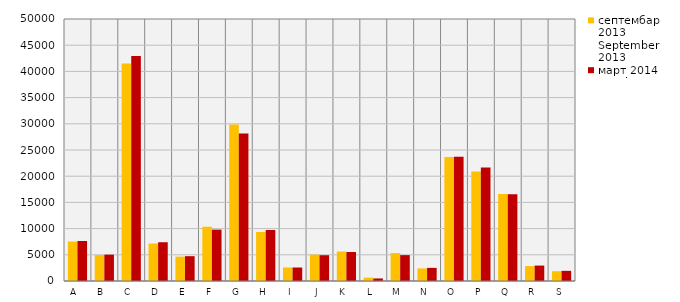
| Category | септембар 2013
September 2013 | март 2014
March 2014 |
|---|---|---|
| A  | 7527 | 7634 |
| B  | 4937 | 5028 |
| C  | 41525 | 42962 |
| D  | 7154 | 7400 |
| Е  | 4650 | 4739 |
| F  | 10359 | 9805 |
| G  | 29889 | 28140 |
| H  | 9362 | 9728 |
| I  | 2581 | 2573 |
| J  | 5033 | 4922 |
| K  | 5628 | 5532 |
| L  | 643 | 487 |
| M  | 5322 | 4940 |
| N  | 2392 | 2506 |
| O  | 23683 | 23714 |
| P  | 20916 | 21645 |
| Q  | 16599 | 16551 |
| R  | 2849 | 2943 |
| S  | 1868 | 1938 |